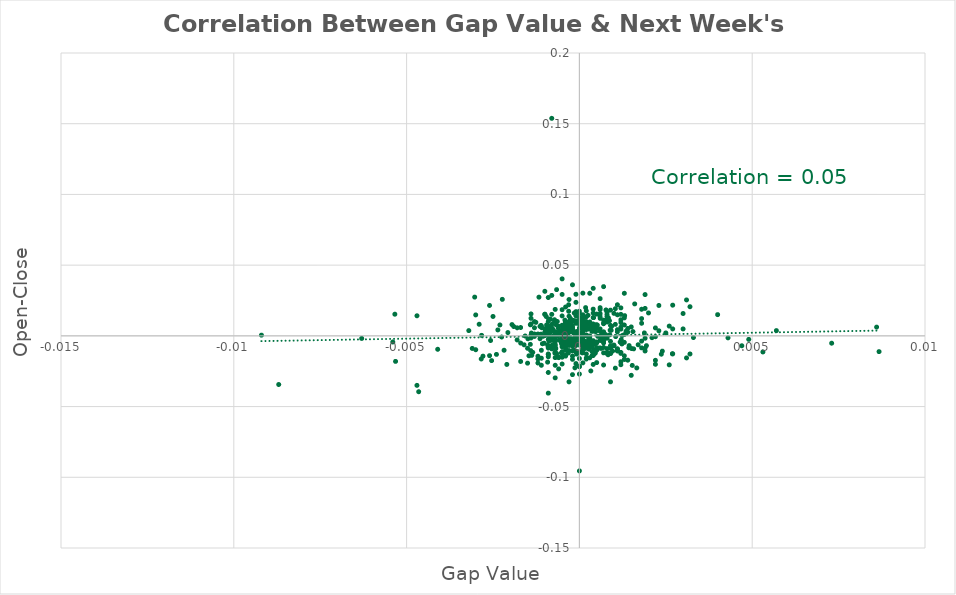
| Category | Series 0 |
|---|---|
| -0.00048999999999999 | -0.007 |
| -0.000419999999999975 | 0.007 |
| -0.000200000000000089 | -0.014 |
| -0.00102000000000002 | -0.005 |
| -0.000120000000000009 | -0.003 |
| -0.000340000000000007 | 0.005 |
| 0.000680000000000013 | -0.001 |
| -0.000850000000000017 | -0.001 |
| -0.000170000000000003 | -0.01 |
| 0.000249999999999972 | 0.015 |
| -0.000479999999999924 | -0.001 |
| 0.000210000000000043 | -0.005 |
| 0.00046999999999997 | 0.007 |
| 0.00121000000000004 | -0.003 |
| -0.000789999999999957 | 0.005 |
| 0.000330000000000052 | -0.025 |
| 4.000000000004e-05 | 0.001 |
| -0.00104999999999999 | 0 |
| 0.000269999999999992 | -0.002 |
| 0.000379999999999935 | 0.004 |
| 0.000529999999999919 | 0 |
| -0.000889999999999946 | 0.012 |
| -0.000340000000000007 | 0 |
| -0.000260000000000038 | 0.006 |
| 0.000259999999999927 | 0.005 |
| 0.000770000000000048 | 0.018 |
| 0.000110000000000054 | -0.003 |
| 0.00151000000000001 | -0.009 |
| -0.000659999999999993 | 0.001 |
| -0.00224999999999997 | -0.001 |
| -0.000130000000000074 | -0.023 |
| -0.000659999999999993 | -0.013 |
| -0.000520000000000076 | -0.005 |
| 0.000180000000000069 | 0.007 |
| -0.000680000000000013 | -0.009 |
| 0.000390000000000001 | -0.005 |
| -0.000819999999999931 | 0.005 |
| 0.000439999999999995 | -0.006 |
| -0.00139999999999995 | -0.002 |
| -0.00236000000000002 | 0.004 |
| 0.00193999999999994 | -0.007 |
| -0.00109000000000003 | 0.006 |
| -0.00110999999999994 | 0.001 |
| -0.000260000000000038 | 0.012 |
| 8.99999999999234e-05 | 0.007 |
| 2.000000000002e-05 | 0.001 |
| -0.00138000000000004 | -0.014 |
| -0.000150000000000094 | 0.016 |
| 0.000460000000000016 | -0.012 |
| -0.000719999999999942 | 0.011 |
| 0.00117999999999995 | -0.004 |
| -0.00125999999999992 | 0.01 |
| -0.000950000000000006 | 0.008 |
| -0.00091999999999992 | -0.019 |
| -0.000269999999999992 | -0.003 |
| -0.000430000000000041 | 0.004 |
| 0.000539999999999984 | -0.009 |
| 0.000219999999999998 | 0.008 |
| -0.000149999999999983 | -0.003 |
| -3.99999999999289e-05 | 0.003 |
| -1.00000000000655e-05 | 0.001 |
| 0.000519999999999964 | 0.008 |
| 0.00104000000000004 | 0.019 |
| -0.000700000000000033 | 0.002 |
| 0.000920000000000031 | 0.004 |
| -0.00051000000000001 | 0.003 |
| -0.000910000000000077 | 0.003 |
| 0.000759999999999982 | 0.001 |
| -0.000319999999999987 | 0.01 |
| 8.99999999999234e-05 | -0.001 |
| 0.0 | 0.01 |
| 3.99999999999289e-05 | 0 |
| 0.00124000000000001 | 0 |
| 0.000129999999999963 | -0.009 |
| -0.000419999999999975 | 0.011 |
| 0.00044999999999995 | -0.006 |
| -9.00000000000345e-05 | -0.002 |
| 0.000820000000000042 | 0.011 |
| 0.00165999999999999 | -0.023 |
| -0.000659999999999993 | 0.033 |
| -0.00465000000000004 | -0.039 |
| -0.00531999999999999 | -0.018 |
| -0.00222999999999995 | 0.026 |
| 0.00131000000000003 | 0.014 |
| -0.000820000000000042 | 0.003 |
| -0.000480000000000036 | -0.005 |
| 0.000369999999999981 | -0.014 |
| -0.00114000000000003 | 0.007 |
| -0.00053000000000003 | -0.004 |
| -0.000760000000000093 | 0.004 |
| -0.00148999999999999 | -0.002 |
| -0.000350000000000072 | 0.002 |
| -0.00110999999999994 | 0.007 |
| -0.000990000000000046 | 0 |
| 0.00046999999999997 | 0.007 |
| 0.000190000000000023 | 0.01 |
| 0.000689999999999968 | -0.002 |
| -0.000750000000000028 | -0.008 |
| -0.000929999999999986 | 0.007 |
| 8.000000000008e-05 | -0.012 |
| -8.99999999999234e-05 | 0.009 |
| 0.00042999999999993 | -0.01 |
| 0.00040999999999991 | 0.013 |
| -0.000470000000000081 | -0.002 |
| 0.000120000000000009 | -0.004 |
| 0.000750000000000028 | 0.001 |
| -0.00256999999999996 | -0.003 |
| -0.000360000000000027 | -0.003 |
| -4.99999999999944e-05 | 0.002 |
| -0.00253999999999998 | -0.017 |
| -0.000580000000000024 | 0.003 |
| 0.000290000000000012 | -0.006 |
| 0.000870000000000037 | 0.011 |
| -0.000170000000000003 | 0.011 |
| 0.00095999999999996 | -0.011 |
| 0.0 | 0.002 |
| -0.000380000000000047 | 0.007 |
| 0.00268999999999997 | -0.013 |
| -4.99999999999944e-05 | 0 |
| -0.000310000000000032 | 0.022 |
| 0.00156999999999996 | -0.009 |
| 0.00016000000000016 | 0.013 |
| -0.000459999999999904 | 0.001 |
| -0.000780000000000002 | 0.008 |
| -0.00085999999999986 | 0 |
| -0.000900000000000122 | 0.004 |
| -0.00059000000000009 | 0.003 |
| -0.000919999999999809 | -0.006 |
| -0.000520000000000076 | -0.012 |
| -0.000779999999999891 | -0.003 |
| -0.000500000000000056 | -0.006 |
| 0.000789999999999957 | -0.001 |
| 9.00000000001455e-05 | 0.009 |
| -0.000479999999999813 | 0.006 |
| -0.00141000000000002 | -0.01 |
| -0.00115000000000009 | 0 |
| -0.000489999999999879 | 0.004 |
| -0.000280000000000058 | -0.005 |
| -0.00141999999999997 | -0.006 |
| -0.00059000000000009 | -0.003 |
| -0.00112999999999996 | 0.001 |
| 0.000369999999999981 | -0.011 |
| -0.000170000000000003 | 0.002 |
| -0.000709999999999988 | -0.003 |
| -1.00000000000655e-05 | 0.011 |
| -0.00282999999999999 | 0 |
| 0.000370000000000092 | -0.008 |
| -0.000279999999999947 | 0.009 |
| -0.00053000000000003 | -0.002 |
| -0.000380000000000047 | 0.002 |
| -0.000609999999999999 | 0.005 |
| -0.000250000000000083 | -0.003 |
| -0.000219999999999998 | -0.006 |
| -0.00114000000000003 | -0.002 |
| -0.00159999999999993 | -0.006 |
| 9.99999999995449e-06 | 0.001 |
| -0.00134999999999996 | -0.012 |
| 0.00103999999999993 | -0.023 |
| 9.99999999999889e-05 | 0.01 |
| -0.000680000000000013 | 0.001 |
| 0.000619999999999953 | 0 |
| -0.00095999999999996 | 0.014 |
| -0.000720000000000053 | 0.011 |
| -0.000709999999999988 | -0.001 |
| -0.000450000000000061 | -0.001 |
| -0.000780000000000002 | 0 |
| -0.000730000000000008 | -0.003 |
| -0.000410000000000021 | 0.009 |
| -0.000709999999999988 | -0.012 |
| 0.000669999999999948 | 0.001 |
| 3.99999999999289e-05 | -0.002 |
| -0.00195 | 0.008 |
| -0.00146000000000001 | -0.014 |
| 0.000360000000000027 | 0.003 |
| 0.00135000000000007 | 0.003 |
| -0.000840000000000062 | 0.007 |
| -0.000649999999999928 | 0.002 |
| 0.000129999999999963 | 0 |
| -0.000320000000000098 | -0.012 |
| -0.000399999999999955 | -0.014 |
| -7.99999999999689e-05 | -0.013 |
| -0.000879999999999991 | -0.004 |
| -0.000780000000000002 | -0.006 |
| -0.000500000000000056 | -0.007 |
| 0.000500000000000056 | 0.005 |
| -0.000130000000000074 | -0.001 |
| -0.00283999999999995 | -0.016 |
| -0.000229999999999952 | -0.002 |
| 0.000209999999999932 | -0.009 |
| 7.99999999999689e-05 | 0.012 |
| 0.00143999999999999 | -0.007 |
| 0.00046999999999997 | 0.003 |
| -0.00302999999999997 | 0.027 |
| 0.000890000000000057 | 0.004 |
| 0.000490000000000101 | 0.008 |
| -0.00156999999999996 | 0 |
| 0.000700000000000033 | 0.003 |
| 0.00530999999999992 | -0.011 |
| -0.000369999999999981 | 0.003 |
| -0.000240000000000018 | 0.01 |
| -0.000609999999999999 | 0.007 |
| -0.0020699999999999 | 0.002 |
| 9.00000000000345e-05 | -0.003 |
| 0.000419999999999975 | -0.013 |
| -0.000360000000000027 | -0.01 |
| -0.000210000000000043 | 0.003 |
| 0.000279999999999947 | -0.009 |
| 0.00154999999999994 | 0.003 |
| 0.00143000000000004 | -0.008 |
| 0.00236999999999998 | -0.013 |
| -0.00534000000000001 | 0.015 |
| -0.00218000000000007 | -0.01 |
| -0.000419999999999975 | 0.008 |
| -7.00000000000145e-05 | -0.003 |
| -0.000639999999999973 | 0.01 |
| 0.000179999999999958 | -0.004 |
| -0.000600000000000044 | -0.023 |
| -0.000310000000000032 | 0.017 |
| -0.000619999999999953 | 0 |
| -0.000319999999999987 | -0.006 |
| -0.000280000000000058 | 0.011 |
| -0.000759999999999982 | 0.004 |
| -0.00107000000000001 | -0.006 |
| 0.00122999999999995 | -0.006 |
| 0.000840000000000062 | 0.013 |
| 0.00104999999999999 | -0.001 |
| -0.00117 | 0.027 |
| 0.000829999999999997 | -0.013 |
| -0.00109999999999999 | 0.007 |
| -0.00539999999999996 | -0.004 |
| -0.00141999999999997 | 0.008 |
| 0.000110000000000054 | 0.004 |
| -0.000720000000000053 | -0.007 |
| -0.00279000000000007 | -0.014 |
| -0.000419999999999975 | 0.006 |
| -0.000839999999999951 | 0.012 |
| 0.000689999999999857 | -0.003 |
| -0.000490000000000101 | 0 |
| -1.99999999999089e-05 | -0.005 |
| 0.000879999999999991 | 0.001 |
| -0.000299999999999967 | -0.01 |
| -0.00319999999999998 | 0.004 |
| -0.000580000000000024 | 0.002 |
| 0.00103999999999993 | 0.008 |
| -0.000330000000000163 | 0.009 |
| 0.00187999999999988 | 0.002 |
| -0.000669999999999948 | 0.008 |
| -0.000410000000000021 | 0 |
| 0.00063000000000013 | -0.009 |
| 0.000259999999999927 | -0.006 |
| -0.00139 | 0.002 |
| 0.000110000000000054 | -0.003 |
| 0.00152999999999992 | -0.021 |
| 0.00866999999999995 | -0.011 |
| 0.000179999999999958 | 0.02 |
| 0.000929999999999986 | 0.007 |
| -0.000399999999999955 | -0.003 |
| 0.000419999999999975 | -0.012 |
| 0.0 | -0.006 |
| -0.000299999999999967 | -0.001 |
| 0.000199999999999978 | 0.01 |
| -0.000299999999999967 | -0.005 |
| 0.000199999999999978 | 0.005 |
| 0.000299999999999967 | -0.002 |
| 0.00130000000000007 | -0.017 |
| -0.000500000000000056 | 0.014 |
| -0.001 | 0.005 |
| -9.99999999999889e-05 | -0.011 |
| 0.000900000000000011 | 0.018 |
| -0.000199999999999978 | -0.005 |
| -0.00129999999999996 | 0 |
| 0.00109999999999999 | -0.009 |
| 0.00250000000000005 | 0.002 |
| 0.00190000000000001 | -0.011 |
| -0.000399999999999955 | 0.004 |
| 0.00129999999999996 | 0.013 |
| -0.000500000000000056 | 0.018 |
| 0.000700000000000033 | -0.004 |
| -0.000500000000000056 | -0.015 |
| -0.000200000000000089 | -0.003 |
| -0.00120000000000009 | -0.014 |
| 0.000599999999999933 | 0.02 |
| -0.00239999999999995 | -0.013 |
| -0.000600000000000044 | -0.015 |
| 0.000600000000000044 | 0.005 |
| -0.000699999999999922 | 0.019 |
| 0.000200000000000089 | -0.008 |
| 0.000199999999999978 | 0.014 |
| 9.99999999999889e-05 | 0.011 |
| 0.00119999999999997 | 0.005 |
| -0.000200000000000089 | -0.007 |
| 0.00119999999999997 | -0.012 |
| 0.00119999999999997 | 0.015 |
| -0.000999999999999889 | 0.031 |
| -0.000399999999999955 | -0.007 |
| -0.000600000000000156 | -0.015 |
| 0.000299999999999967 | -0.007 |
| 0.00859999999999994 | 0.006 |
| -0.000199999999999978 | -0.005 |
| 0.00119999999999997 | 0.006 |
| 0.000900000000000011 | -0.008 |
| 0.00109999999999999 | 0.015 |
| 0.000399999999999955 | 0.034 |
| 0.0011000000000001 | -0.01 |
| 0.000799999999999911 | -0.012 |
| -0.000700000000000145 | -0.001 |
| -0.00209999999999999 | -0.02 |
| 0.000699999999999922 | -0.008 |
| -0.000900000000000011 | -0.026 |
| -0.000399999999999955 | 0.008 |
| -9.99999999999889e-05 | 0.01 |
| -0.000399999999999955 | 0.007 |
| 0.00109999999999999 | -0.009 |
| 0.000199999999999978 | 0 |
| -0.001 | 0.003 |
| -0.000399999999999955 | -0.01 |
| 0.000199999999999978 | -0.016 |
| 0.000299999999999967 | 0.03 |
| -0.00170000000000003 | 0.006 |
| 0.00140000000000006 | -0.017 |
| 9.99999999999889e-05 | -0.003 |
| -0.000299999999999967 | -0.001 |
| 0.00260000000000004 | -0.02 |
| 0.003 | 0.005 |
| 0.0048999999999999 | -0.003 |
| -0.00120000000000009 | -0.016 |
| 0.00180000000000002 | 0.012 |
| 0.0 | 0.011 |
| 0.0 | 0.001 |
| 0.000600000000000044 | 0.003 |
| 0.0 | -0.027 |
| 0.000399999999999955 | 0.016 |
| 0.00140000000000006 | 0.003 |
| 0.00109999999999999 | 0.022 |
| -0.000900000000000011 | -0.003 |
| 0.00190000000000001 | 0.029 |
| -0.000199999999999978 | -0.027 |
| 0.000299999999999967 | 0.01 |
| -0.00139999999999995 | 0.012 |
| -0.000500000000000167 | 0.029 |
| 0.000499999999999944 | -0.019 |
| -0.000299999999999967 | -0.032 |
| 0.00319999999999998 | -0.013 |
| -0.000700000000000033 | -0.006 |
| -0.000300000000000078 | -0.006 |
| 0.00429999999999997 | -0.001 |
| -0.000900000000000011 | -0.04 |
| 0.00120000000000009 | -0.02 |
| -0.000799999999999911 | 0.154 |
| 0.00729999999999986 | -0.005 |
| -0.000400000000000067 | -0.014 |
| -9.99999999999889e-05 | -0.004 |
| -0.000700000000000033 | -0.021 |
| 9.99999999999889e-05 | 0.015 |
| 0.000900000000000011 | -0.012 |
| 0.00260000000000004 | 0.007 |
| -0.000499999999999944 | -0.011 |
| -0.00129999999999996 | 0.006 |
| 0.00190000000000001 | -0.002 |
| -9.99999999999889e-05 | -0.011 |
| 0.000499999999999944 | -0.005 |
| -9.99999999999889e-05 | 0.011 |
| 0.00120000000000009 | 0.011 |
| 0.000299999999999967 | -0.015 |
| -0.000199999999999978 | -0.011 |
| -0.000900000000000011 | -0.009 |
| -9.99999999999889e-05 | -0.002 |
| 0.000700000000000033 | -0.012 |
| 0.00330000000000008 | -0.001 |
| 0.000399999999999955 | -0.011 |
| 0.000399999999999955 | 0.003 |
| 0.000199999999999978 | 0 |
| -9.99999999999889e-05 | -0.001 |
| -0.000700000000000033 | -0.007 |
| -9.99999999999889e-05 | -0.006 |
| 9.99999999999889e-05 | 0.002 |
| 0.0001000000000001 | -0.003 |
| 0.000199999999999978 | 0.005 |
| -0.000199999999999978 | 0.005 |
| -0.000299999999999967 | -0.007 |
| -9.99999999999889e-05 | 0.002 |
| 0.000200000000000089 | 0.001 |
| -0.000399999999999955 | -0.003 |
| 0.000299999999999967 | -0.006 |
| -0.000400000000000067 | -0.009 |
| -0.000699999999999922 | 0.003 |
| -0.000399999999999955 | 0.002 |
| 0.001 | -0.006 |
| 0.0 | 0.016 |
| 9.99999999999889e-05 | -0.005 |
| -0.000400000000000067 | -0.004 |
| 0.000500000000000056 | -0.01 |
| 0.0 | 0.006 |
| -0.00140000000000006 | 0.001 |
| -0.000500000000000056 | 0.007 |
| -0.000900000000000011 | 0.004 |
| 0.000399999999999955 | 0.006 |
| 0.000399999999999955 | 0.008 |
| 9.99999999999889e-05 | -0.012 |
| 0.000799999999999911 | 0.017 |
| -0.000499999999999944 | -0.008 |
| -0.000900000000000011 | 0.002 |
| -0.000900000000000011 | -0.015 |
| -0.000199999999999978 | 0.004 |
| 0.000199999999999978 | -0.007 |
| -0.000300000000000078 | 0.002 |
| -9.99999999999889e-05 | 0.014 |
| -9.99999999999889e-05 | 0 |
| 0.0 | 0.008 |
| 0.000900000000000011 | 0.007 |
| 9.99999999999889e-05 | -0.009 |
| -0.000500000000000056 | -0.02 |
| -9.99999999999889e-05 | 0.009 |
| -0.00229999999999996 | 0.008 |
| -0.000400000000000067 | -0.005 |
| 0.000600000000000044 | -0.001 |
| -0.000500000000000056 | 0.004 |
| -0.00470000000000003 | 0.014 |
| 0.000700000000000033 | 0.009 |
| 0.00170000000000003 | -0.006 |
| -0.000800000000000022 | -0.009 |
| -0.000299999999999967 | 0.004 |
| 9.99999999999889e-05 | -0.004 |
| -0.000300000000000078 | 0.007 |
| 9.99999999999889e-05 | -0.001 |
| 0.000400000000000067 | 0.013 |
| -0.000300000000000078 | 0.005 |
| 0.00190000000000001 | 0.019 |
| 9.99999999999889e-05 | -0.019 |
| 0.00180000000000002 | -0.008 |
| 0.0008999999999999 | -0.013 |
| 0.001 | 0.016 |
| 0.00230000000000008 | 0.022 |
| 0.000399999999999955 | 0.007 |
| -0.00290000000000001 | 0.008 |
| 0.00130000000000007 | -0.014 |
| 0.0 | -0.022 |
| -0.00180000000000002 | 0.006 |
| -0.00109999999999999 | -0.01 |
| 0.000199999999999978 | -0.006 |
| -0.000600000000000044 | 0.007 |
| 0.000499999999999944 | 0.015 |
| 0.000499999999999944 | -0.008 |
| 0.00570000000000003 | 0.004 |
| 0.000800000000000022 | 0.014 |
| -0.000799999999999911 | -0.009 |
| 0.00119999999999997 | -0.012 |
| 0.000900000000000011 | -0.007 |
| 0.000199999999999978 | -0.004 |
| 0.000800000000000022 | -0.009 |
| 0.00119999999999997 | 0.02 |
| 0.000700000000000033 | 0.009 |
| 0.000399999999999955 | -0.02 |
| -0.000199999999999978 | 0.011 |
| -9.99999999999889e-05 | -0.011 |
| 0.00109999999999999 | 0.003 |
| -0.000900000000000011 | 0.001 |
| 0.00180000000000002 | 0.019 |
| -0.000800000000000022 | -0.007 |
| 9.99999999999889e-05 | 0 |
| 0.000199999999999978 | 0.018 |
| -9.99999999999889e-05 | 0.003 |
| 0.001 | -0.007 |
| 0.000700000000000033 | -0.005 |
| 0.0 | -0.006 |
| -0.000400000000000067 | 0.005 |
| 0.000599999999999933 | -0.003 |
| 0.000700000000000033 | 0.011 |
| -9.99999999999889e-05 | -0.007 |
| -0.000399999999999955 | -0.006 |
| -9.99999999999889e-05 | 0.017 |
| -0.000199999999999978 | 0.01 |
| 0.000399999999999955 | 0.005 |
| -0.000299999999999967 | 0.014 |
| 9.99999999999889e-05 | 0.003 |
| -0.000900000000000011 | -0.008 |
| 0.00149999999999994 | 0.006 |
| 0.003 | 0.016 |
| -0.00149999999999994 | -0.009 |
| 0.00209999999999999 | -0.001 |
| -0.000699999999999922 | -0.03 |
| 0.00180000000000002 | 0.009 |
| -0.00409999999999999 | -0.009 |
| -0.00920000000000009 | 0 |
| 0.00129999999999996 | 0.008 |
| -0.003 | -0.01 |
| 0.00119999999999997 | -0.018 |
| 0.000900000000000011 | -0.009 |
| 0.00469999999999992 | -0.007 |
| 0.00109999999999999 | -0.011 |
| 0.00270000000000003 | 0.005 |
| 0.000800000000000022 | 0.012 |
| -0.000199999999999978 | -0.003 |
| -0.00109999999999999 | -0.016 |
| -0.000200000000000089 | 0.006 |
| 0.000299999999999967 | 0.008 |
| 0.00109999999999999 | 0.004 |
| 0.000500000000000056 | -0.004 |
| -0.00120000000000009 | -0.019 |
| -0.00260000000000004 | 0.021 |
| -0.00170000000000003 | -0.005 |
| 0.00230000000000008 | 0.004 |
| -0.000400000000000067 | -0.006 |
| 0.00309999999999999 | 0.025 |
| 0.00319999999999998 | 0.021 |
| 0.00220000000000009 | 0.006 |
| -0.000199999999999978 | -0.017 |
| 0.000800000000000022 | -0.002 |
| 0.000300000000000078 | 0 |
| 0.00240000000000006 | -0.011 |
| -0.000400000000000067 | -0.002 |
| -0.00190000000000001 | 0.007 |
| 0.000800000000000022 | -0.012 |
| -0.00170000000000003 | -0.018 |
| 0.00270000000000003 | -0.013 |
| 0.0 | -0.021 |
| 0.00270000000000003 | 0.022 |
| 0.000800000000000022 | 0.01 |
| -0.000199999999999978 | 0.036 |
| 0.00220000000000009 | -0.017 |
| -0.000199999999999978 | -0.003 |
| 0.00150000000000005 | -0.028 |
| 0.00120000000000009 | 0.009 |
| 0.0 | -0.095 |
| 0.000599999999999933 | 0.019 |
| 0.000700000000000033 | -0.021 |
| 9.99999999999889e-05 | -0.007 |
| 0.0 | -0.011 |
| 0.000399999999999955 | 0.019 |
| 0.000700000000000033 | 0.035 |
| 0.000900000000000011 | -0.004 |
| 0.00160000000000004 | 0.023 |
| 0.000599999999999933 | 0.012 |
| -0.000700000000000033 | -0.015 |
| 0.002 | 0.016 |
| 0.000299999999999967 | -0.004 |
| 0.000600000000000044 | -0.008 |
| -0.003 | 0.015 |
| 0.000600000000000044 | 0.026 |
| 0.000600000000000044 | 0.016 |
| 0.000399999999999955 | -0.014 |
| 0.000199999999999978 | -0.013 |
| -0.000400000000000067 | 0.02 |
| 0.000399999999999955 | 0.006 |
| 0.000800000000000022 | 0.015 |
| 0.0 | 0.017 |
| 0.000400000000000067 | -0.003 |
| -9.99999999999889e-05 | -0.02 |
| -9.99999999999889e-05 | 0.029 |
| 0.00119999999999997 | -0.005 |
| -0.000300000000000078 | 0.004 |
| -0.001 | 0.015 |
| 0.00130000000000007 | 0.03 |
| 0.00309999999999999 | -0.016 |
| -0.000900000000000011 | -0.013 |
| -0.00249999999999994 | 0.014 |
| -0.0008999999999999 | 0.004 |
| 0.00140000000000006 | 0.005 |
| 0.000900000000000011 | -0.032 |
| -0.000900000000000011 | 0.027 |
| -0.000300000000000078 | 0.006 |
| 0.004 | 0.015 |
| 0.00129999999999996 | -0.005 |
| -0.000799999999999911 | 0.029 |
| -0.000699999999999922 | -0.011 |
| -0.00260000000000004 | -0.014 |
| 0.00219999999999998 | -0.02 |
| -9.99999999999889e-05 | 0.024 |
| -0.00309999999999999 | -0.009 |
| -0.00149999999999994 | -0.019 |
| -0.000399999999999955 | 0.004 |
| -0.000900000000000011 | 0.01 |
| -0.00140000000000006 | 0.008 |
| -0.000299999999999967 | 0.026 |
| -0.000399999999999955 | 0.01 |
| 0.0 | -0.003 |
| -0.00130000000000007 | 0.01 |
| 9.99999999999889e-05 | 0.006 |
| -0.00140000000000006 | 0.016 |
| -0.0008999999999999 | -0.013 |
| -0.00130000000000007 | 0.001 |
| 0.0 | 0.013 |
| 0.0 | -0.004 |
| -0.0002000000000002 | 0.007 |
| 0.000299999999999967 | 0.005 |
| 9.99999999999889e-05 | 0.03 |
| -0.000800000000000133 | 0.015 |
| -0.000499999999999944 | 0.04 |
| 0.000600000000000156 | 0.014 |
| -0.000699999999999922 | -0.004 |
| 9.99999999999889e-05 | -0.01 |
| 0.000199999999999978 | -0.016 |
| -0.00870000000000015 | -0.034 |
| -0.00469999999999992 | -0.035 |
| 0.00180000000000002 | -0.004 |
| 0.00190000000000001 | -0.009 |
| -0.000800000000000133 | 0.003 |
| 0.000699999999999922 | -0.004 |
| -0.00629999999999997 | -0.002 |
| -0.000499999999999944 | -0.004 |
| -0.000300000000000189 | -0.004 |
| -0.00100000000000011 | 0.015 |
| 0.000700000000000145 | 0 |
| -0.00119999999999986 | 0.001 |
| 0.00130000000000007 | 0.001 |
| 0.00219999999999998 | -0.001 |
| -0.000499999999999944 | -0.012 |
| -0.00109999999999987 | -0.021 |
| 0.0 | -0.016 |
| -0.00180000000000002 | -0.003 |